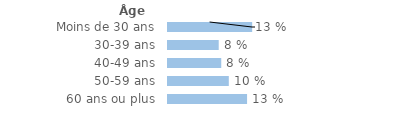
| Category | Series 0 |
|---|---|
| Moins de 30 ans | 0.134 |
| 30-39 ans | 0.08 |
| 40-49 ans | 0.084 |
| 50-59 ans | 0.096 |
| 60 ans ou plus | 0.126 |